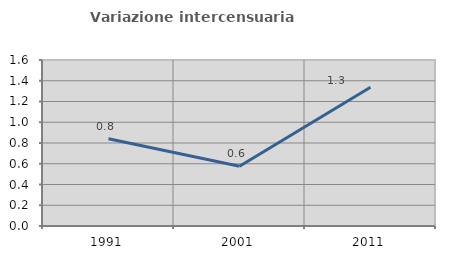
| Category | Variazione intercensuaria annua |
|---|---|
| 1991.0 | 0.84 |
| 2001.0 | 0.576 |
| 2011.0 | 1.338 |